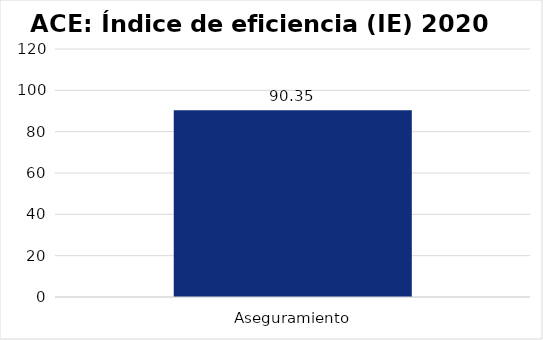
| Category | Índice de eficiencia (IE)  |
|---|---|
| Aseguramiento | 90.345 |